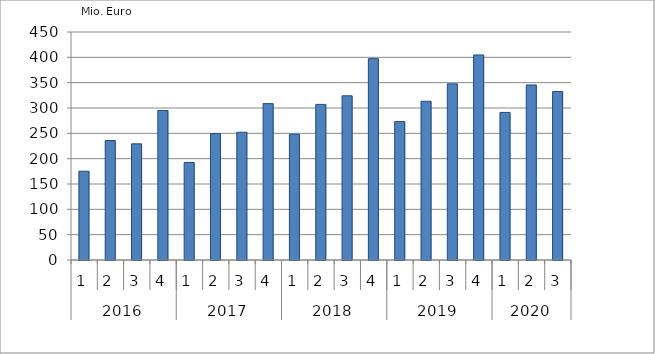
| Category | Ausbaugewerblicher Umsatz3 |
|---|---|
| 0 | 175225.59 |
| 1 | 235781.631 |
| 2 | 229227.559 |
| 3 | 294992.157 |
| 4 | 192499.539 |
| 5 | 249394.388 |
| 6 | 252146.755 |
| 7 | 308653.153 |
| 8 | 248133.418 |
| 9 | 307099.899 |
| 10 | 324088.989 |
| 11 | 397377.201 |
| 12 | 273159.137 |
| 13 | 313254.251 |
| 14 | 347631.281 |
| 15 | 404721.054 |
| 16 | 291272.144 |
| 17 | 345494.215 |
| 18 | 332629.265 |